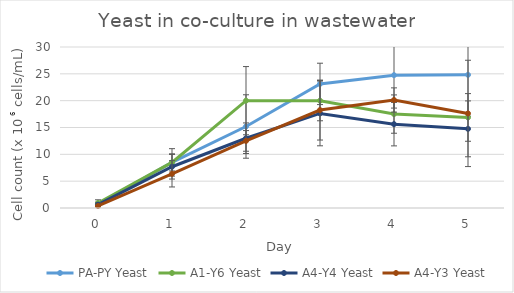
| Category | PA-PY Yeast | A1-Y6 Yeast | A4-Y4 Yeast | A4-Y3 Yeast |
|---|---|---|---|---|
| 0.0 | 0.688 | 0.938 | 0.625 | 0.375 |
| 1.0 | 8.5 | 8.5 | 7.688 | 6.375 |
| 2.0 | 15.188 | 20 | 13 | 12.5 |
| 3.0 | 23.125 | 20 | 17.625 | 18.25 |
| 4.0 | 24.75 | 17.5 | 15.625 | 20.125 |
| 5.0 | 24.812 | 16.875 | 14.75 | 17.625 |